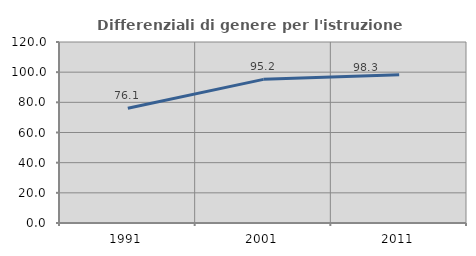
| Category | Differenziali di genere per l'istruzione superiore |
|---|---|
| 1991.0 | 76.077 |
| 2001.0 | 95.227 |
| 2011.0 | 98.29 |